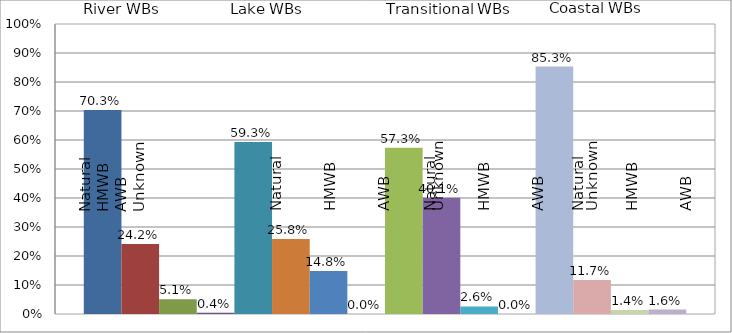
| Category | Natural water bodies | Heavily modified water bodies | Artificial water bodies | Unknown  | Natural lake | HMWB lake | AWB lake | unknown lake | natural trans. | HMWB trans. | AWB trans. | unknown trans. | natural coastal | HMWB coastal | AWB coastal | unknown coastal |
|---|---|---|---|---|---|---|---|---|---|---|---|---|---|---|---|---|
| Heavily Modified | 0.703 | 0.242 | 0.051 | 0.004 | 0.593 | 0.258 | 0.148 | 0 | 0.573 | 0.401 | 0.026 | 0 | 0.853 | 0.117 | 0.014 | 0.016 |